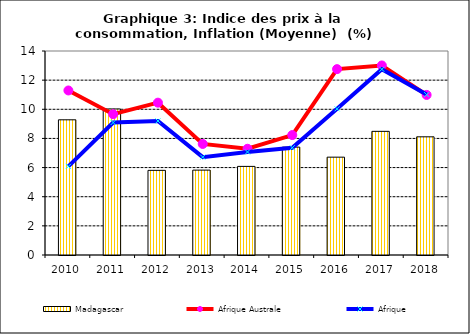
| Category | Madagascar |
|---|---|
| 2010.0 | 9.278 |
| 2011.0 | 10.02 |
| 2012.0 | 5.81 |
| 2013.0 | 5.825 |
| 2014.0 | 6.08 |
| 2015.0 | 7.404 |
| 2016.0 | 6.714 |
| 2017.0 | 8.486 |
| 2018.0 | 8.11 |